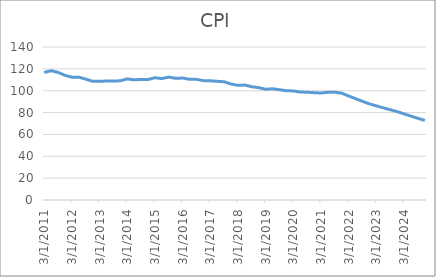
| Category | CPI | GDP |
|---|---|---|
| 3/31/11 | 116.7 |  |
| 6/30/11 | 118.3 |  |
| 9/30/11 | 116.8 |  |
| 12/31/11 | 114.1 |  |
| 3/31/12 | 112.4 |  |
| 6/30/12 | 112.4 |  |
| 9/30/12 | 110.6 |  |
| 12/31/12 | 108.6 |  |
| 3/31/13 | 108.6 |  |
| 6/30/13 | 108.9 |  |
| 9/30/13 | 108.8 |  |
| 12/31/13 | 109.1 |  |
| 3/31/14 | 110.8 |  |
| 6/30/14 | 110 |  |
| 9/30/14 | 110.3 |  |
| 12/31/14 | 110.2 |  |
| 3/31/15 | 111.9 |  |
| 6/30/15 | 111.1 |  |
| 9/30/15 | 112.5 |  |
| 12/31/15 | 111.3 |  |
| 3/31/16 | 111.6 |  |
| 6/30/16 | 110.5 |  |
| 9/30/16 | 110.4 |  |
| 12/31/16 | 109.2 |  |
| 3/31/17 | 109.1 |  |
| 6/30/17 | 108.6 |  |
| 9/30/17 | 108.2 |  |
| 12/31/17 | 106.1 |  |
| 3/31/18 | 104.9 |  |
| 6/30/18 | 105.2 |  |
| 9/30/18 | 103.6 |  |
| 12/31/18 | 102.8 |  |
| 3/31/19 | 101.3 |  |
| 6/30/19 | 101.8 |  |
| 9/30/19 | 100.9 |  |
| 12/31/19 | 100 |  |
| 3/31/20 | 99.8 |  |
| 6/30/20 | 98.8 |  |
| 9/30/20 | 98.6 |  |
| 12/31/20 | 98.2 |  |
| 3/31/21 | 97.9 |  |
| 6/30/21 | 98.6 |  |
| 9/30/21 | 98.6 |  |
| 12/31/21 | 97.7 |  |
| 3/31/22 | 95.16 |  |
| 6/30/22 | 92.686 |  |
| 9/30/22 | 90.277 |  |
| 12/31/22 | 87.93 |  |
| 3/31/23 | 86.116 |  |
| 6/30/23 | 84.339 |  |
| 9/30/23 | 82.6 |  |
| 12/31/23 | 80.896 |  |
| 3/31/24 | 78.793 |  |
| 6/30/24 | 76.744 |  |
| 9/30/24 | 74.749 |  |
| 12/31/24 | 72.806 |  |